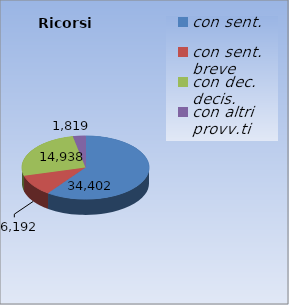
| Category | Ricorsi definiti |
|---|---|
| con sent. | 34402 |
| con sent. breve | 6192 |
| con dec. decis. | 14938 |
| con altri provv.ti | 1819 |